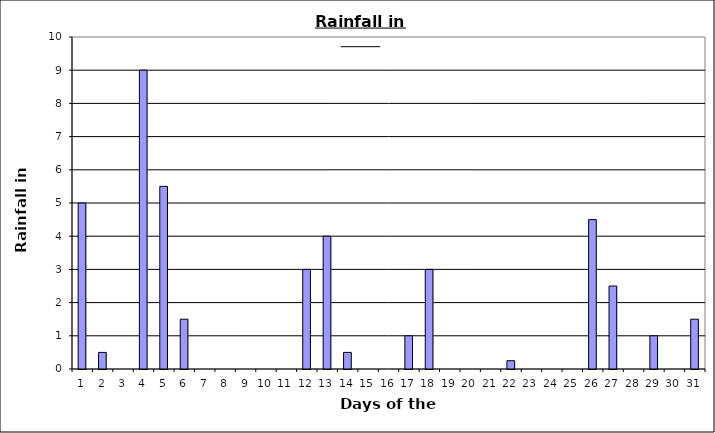
| Category | Series 0 |
|---|---|
| 0 | 5 |
| 1 | 0.5 |
| 2 | 0 |
| 3 | 9 |
| 4 | 5.5 |
| 5 | 1.5 |
| 6 | 0 |
| 7 | 0 |
| 8 | 0 |
| 9 | 0 |
| 10 | 0 |
| 11 | 3 |
| 12 | 4 |
| 13 | 0.5 |
| 14 | 0 |
| 15 | 0 |
| 16 | 1 |
| 17 | 3 |
| 18 | 0 |
| 19 | 0 |
| 20 | 0 |
| 21 | 0.25 |
| 22 | 0 |
| 23 | 0 |
| 24 | 0 |
| 25 | 4.5 |
| 26 | 2.5 |
| 27 | 0 |
| 28 | 1 |
| 29 | 0 |
| 30 | 1.5 |